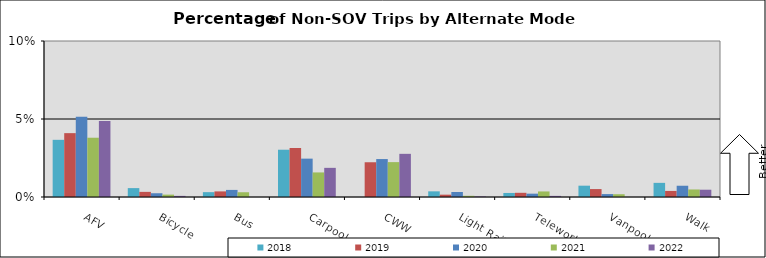
| Category | 2018 | 2019 | 2020 | 2021 | 2022 |
|---|---|---|---|---|---|
| AFV | 0.037 | 0.041 | 0.051 | 0.038 | 0.049 |
| Bicycle | 0.006 | 0.003 | 0.002 | 0.002 | 0.001 |
| Bus | 0.003 | 0.004 | 0.005 | 0.003 | 0 |
| Carpool | 0.03 | 0.031 | 0.025 | 0.016 | 0.019 |
| CWW | 0 | 0.022 | 0.024 | 0.022 | 0.028 |
| Light Rail | 0.004 | 0.001 | 0.003 | 0.001 | 0 |
| Telework | 0.003 | 0.003 | 0.002 | 0.004 | 0.001 |
| Vanpool | 0.007 | 0.005 | 0.002 | 0.002 | 0 |
| Walk | 0.009 | 0.004 | 0.007 | 0.005 | 0.005 |